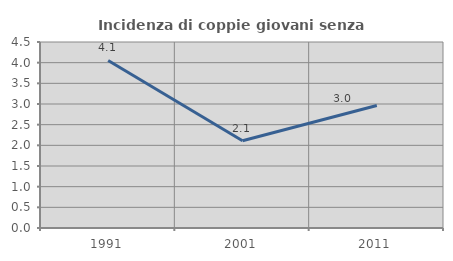
| Category | Incidenza di coppie giovani senza figli |
|---|---|
| 1991.0 | 4.054 |
| 2001.0 | 2.111 |
| 2011.0 | 2.965 |